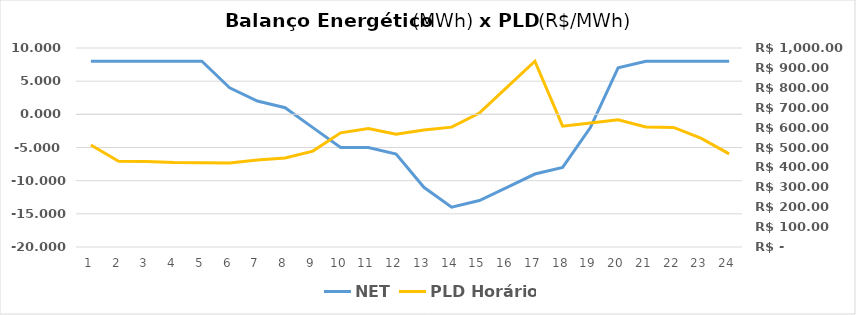
| Category | NET |
|---|---|
| 0 | 8 |
| 1 | 8 |
| 2 | 8 |
| 3 | 8 |
| 4 | 8 |
| 5 | 4 |
| 6 | 2 |
| 7 | 1 |
| 8 | -2 |
| 9 | -5 |
| 10 | -5 |
| 11 | -6 |
| 12 | -11 |
| 13 | -14 |
| 14 | -13 |
| 15 | -11 |
| 16 | -9 |
| 17 | -8 |
| 18 | -2 |
| 19 | 7 |
| 20 | 8 |
| 21 | 8 |
| 22 | 8 |
| 23 | 8 |